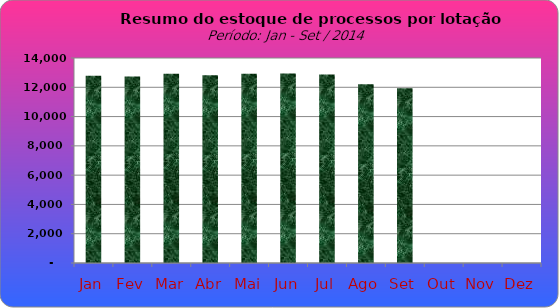
| Category | Series 0 |
|---|---|
| Jan | 12795 |
| Fev | 12744 |
| Mar | 12928 |
| Abr | 12816 |
| Mai | 12923 |
| Jun | 12943 |
| Jul | 12869 |
| Ago | 12202 |
| Set | 11937 |
| Out | 0 |
| Nov | 0 |
| Dez | 0 |